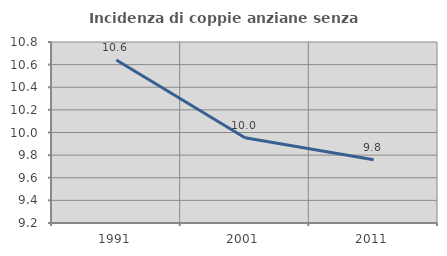
| Category | Incidenza di coppie anziane senza figli  |
|---|---|
| 1991.0 | 10.641 |
| 2001.0 | 9.954 |
| 2011.0 | 9.759 |